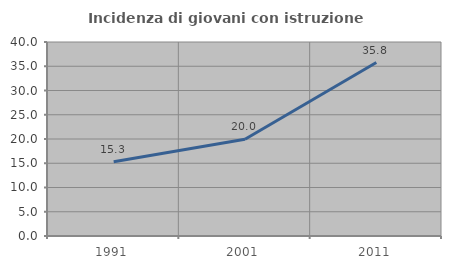
| Category | Incidenza di giovani con istruzione universitaria |
|---|---|
| 1991.0 | 15.289 |
| 2001.0 | 19.958 |
| 2011.0 | 35.766 |